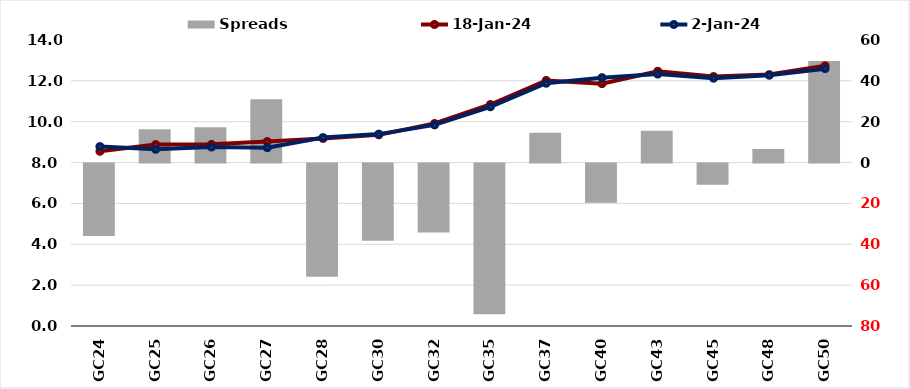
| Category |  Spreads   |
|---|---|
| GC24 | -35.422 |
| GC25 | 16.309 |
| GC26 | 17.242 |
| GC27 | 31.035 |
| GC28 | -55.441 |
| GC30 | -37.733 |
| GC32 | -33.712 |
| GC35 | -73.765 |
| GC37 | 14.577 |
| GC40 | -19.153 |
| GC43 | 15.629 |
| GC45 | -10.377 |
| GC48 | 6.637 |
| GC50 | 49.745 |